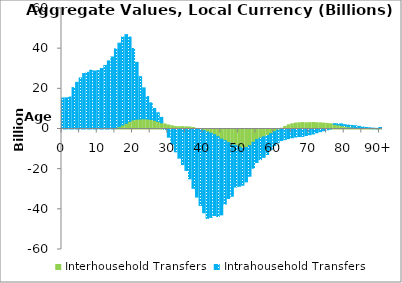
| Category | Interhousehold Transfers | Intrahousehold Transfers |
|---|---|---|
| 0 | 0 | 15424.118 |
|  | 0 | 15508.026 |
| 2 | 0 | 15924.417 |
| 3 | 0 | 20610.805 |
| 4 | 0 | 23240.93 |
| 5 | 0 | 25407.215 |
| 6 | 0 | 27637.973 |
| 7 | 0 | 28204.765 |
| 8 | 0 | 29240.108 |
| 9 | 0 | 28872.986 |
| 10 | 0 | 29076.78 |
| 11 | 0 | 30104.654 |
| 12 | 0 | 31667.287 |
| 13 | 0 | 33916.751 |
| 14 | 0 | 35869.759 |
| 15 | 605.24 | 39295.37 |
| 16 | 1153.856 | 41557.907 |
| 17 | 1992.812 | 43770.752 |
| 18 | 2840.909 | 44157.564 |
| 19 | 3856.226 | 41910.064 |
| 20 | 4566.661 | 35518.2 |
| 21 | 4878.317 | 28300.416 |
| 22 | 5004.945 | 21051.583 |
| 23 | 5103.237 | 15383.478 |
| 24 | 4980.563 | 11175.095 |
| 25 | 4718.676 | 8292.506 |
| 26 | 4340.647 | 5887.584 |
| 27 | 3761.294 | 4332.63 |
| 28 | 3129.517 | 2653.515 |
| 29 | 2488.737 | -251.029 |
| 30 | 1983.232 | -4077.204 |
| 31 | 1594.651 | -7584.486 |
| 32 | 1221.646 | -11364.044 |
| 33 | 1131.099 | -14504.157 |
| 34 | 1177.949 | -17668.535 |
| 35 | 1078.187 | -20617.457 |
| 36 | 1008.378 | -24793.511 |
| 37 | 753.652 | -29518.713 |
| 38 | 292.217 | -33893.176 |
| 39 | -186.058 | -37865.364 |
| 40 | -717.251 | -41001.428 |
| 41 | -1489.927 | -42961.739 |
| 42 | -2108.022 | -41901.395 |
| 43 | -2843.247 | -40224.709 |
| 44 | -3830.254 | -39765.003 |
| 45 | -5017.782 | -37736.944 |
| 46 | -5789.886 | -31576.355 |
| 47 | -6792.153 | -27776.537 |
| 48 | -7974.92 | -25502.723 |
| 49 | -8128.232 | -20789.604 |
| 50 | -8992.363 | -19542.755 |
| 51 | -9467.147 | -18555.465 |
| 52 | -9247.352 | -17090.013 |
| 53 | -8291.569 | -15235.938 |
| 54 | -6643.204 | -12857.056 |
| 55 | -5290.566 | -11408.625 |
| 56 | -4521.547 | -10717.824 |
| 57 | -3882.465 | -10240.222 |
| 58 | -3242.656 | -9464.755 |
| 59 | -2303.831 | -8040.311 |
| 60 | -1367.796 | -6828.888 |
| 61 | -487.922 | -6340.844 |
| 62 | 379.657 | -5728.698 |
| 63 | 1281.589 | -5274.111 |
| 64 | 2074.31 | -4789.375 |
| 65 | 2590.638 | -4375.153 |
| 66 | 2932.77 | -3980.87 |
| 67 | 3086.85 | -3790.432 |
| 68 | 3186.394 | -3706.994 |
| 69 | 3063.563 | -3239.036 |
| 70 | 3146.179 | -2872.818 |
| 71 | 3227.65 | -2466.142 |
| 72 | 3108.113 | -1881.085 |
| 73 | 3042.719 | -1334.172 |
| 74 | 2925.976 | -872.554 |
| 75 | 2751.434 | -408.644 |
| 76 | 2619.667 | -27.557 |
| 77 | 2330.239 | 317.071 |
| 78 | 2041.361 | 564.135 |
| 79 | 1769.829 | 765.339 |
| 80 | 1359.23 | 793.004 |
| 81 | 1092.557 | 821.735 |
| 82 | 904.112 | 869.366 |
| 83 | 745.133 | 886.933 |
| 84 | 555.75 | 777.992 |
| 85 | 378.894 | 635.19 |
| 86 | 258.49 | 511.945 |
| 87 | 181.685 | 408.754 |
| 88 | 122.815 | 304.688 |
| 89 | 76.383 | 220.422 |
| 90+ | 160.513 | 574.635 |